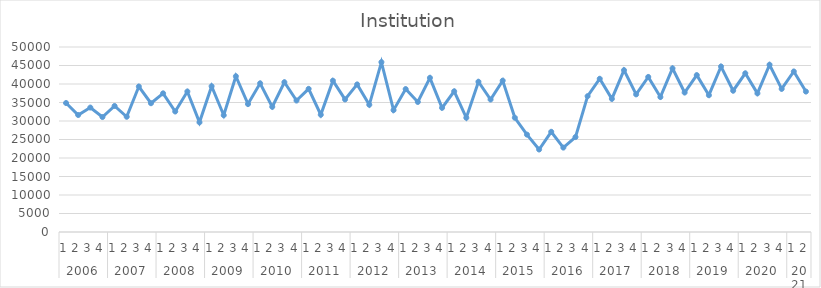
| Category | Institution |
|---|---|
| 0 | 34857 |
| 1 | 31623 |
| 2 | 33634 |
| 3 | 31072 |
| 4 | 34060 |
| 5 | 31146 |
| 6 | 39322 |
| 7 | 34803 |
| 8 | 37477 |
| 9 | 32570 |
| 10 | 37974 |
| 11 | 29636 |
| 12 | 39393 |
| 13 | 31560 |
| 14 | 42090 |
| 15 | 34581 |
| 16 | 40184 |
| 17 | 33830 |
| 18 | 40483 |
| 19 | 35530 |
| 20 | 38689 |
| 21 | 31688 |
| 22 | 40890 |
| 23 | 35831 |
| 24 | 39886 |
| 25 | 34382 |
| 26 | 45902 |
| 27 | 32934 |
| 28 | 38630 |
| 29 | 35146 |
| 30 | 41664 |
| 31 | 33561 |
| 32 | 38030 |
| 33 | 30874 |
| 34 | 40609 |
| 35 | 35806 |
| 36 | 40905 |
| 37 | 30874 |
| 38 | 26317 |
| 39 | 22297 |
| 40 | 27081 |
| 41 | 22809 |
| 42 | 25657 |
| 43 | 36707.69 |
| 44 | 41414.783 |
| 45 | 35985.564 |
| 46 | 43735.453 |
| 47 | 37200.564 |
| 48 | 41907.657 |
| 49 | 36478.439 |
| 50 | 44228.328 |
| 51 | 37693.439 |
| 52 | 42400.531 |
| 53 | 36971.313 |
| 54 | 44721.202 |
| 55 | 38186.313 |
| 56 | 42893.406 |
| 57 | 37464.187 |
| 58 | 45214.076 |
| 59 | 38679.187 |
| 60 | 43386.28 |
| 61 | 37957.062 |